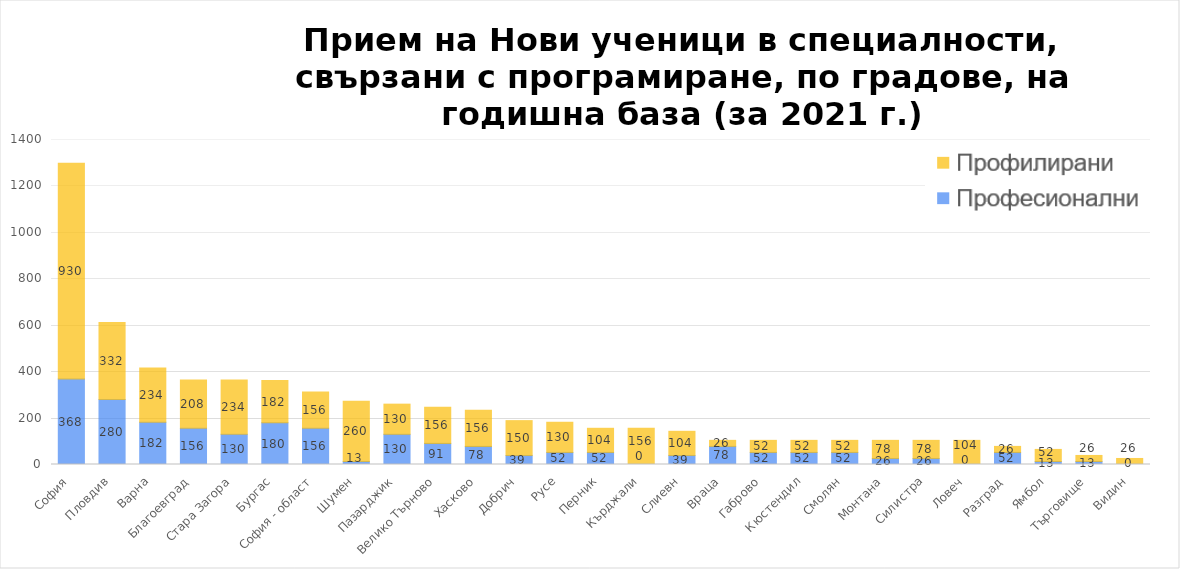
| Category | Профилирани | #REF! |
|---|---|---|
| София | 368 | 930 |
| Пловдив | 280 | 332 |
| Варна | 182 | 234 |
| Благоевград | 156 | 208 |
| Стара Загора | 130 | 234 |
| Бургас | 180 | 182 |
| София - област | 156 | 156 |
| Шумен | 13 | 260 |
| Пазарджик | 130 | 130 |
| Велико Търново | 91 | 156 |
| Хасково | 78 | 156 |
| Добрич | 39 | 150 |
| Русе | 52 | 130 |
| Перник | 52 | 104 |
| Кърджали | 0 | 156 |
| Слиевн | 39 | 104 |
| Враца | 78 | 26 |
| Габрово | 52 | 52 |
| Кюстендил | 52 | 52 |
| Смолян | 52 | 52 |
| Монтана | 26 | 78 |
| Силистра | 26 | 78 |
| Ловеч | 0 | 104 |
| Разград | 52 | 26 |
| Ямбол | 13 | 52 |
| Търговище | 13 | 26 |
| Видин | 0 | 26 |